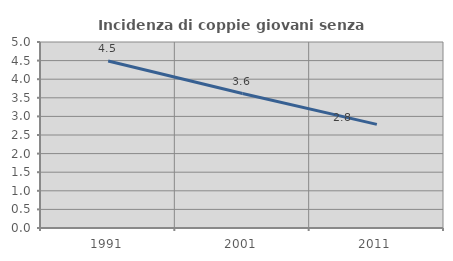
| Category | Incidenza di coppie giovani senza figli |
|---|---|
| 1991.0 | 4.489 |
| 2001.0 | 3.614 |
| 2011.0 | 2.786 |